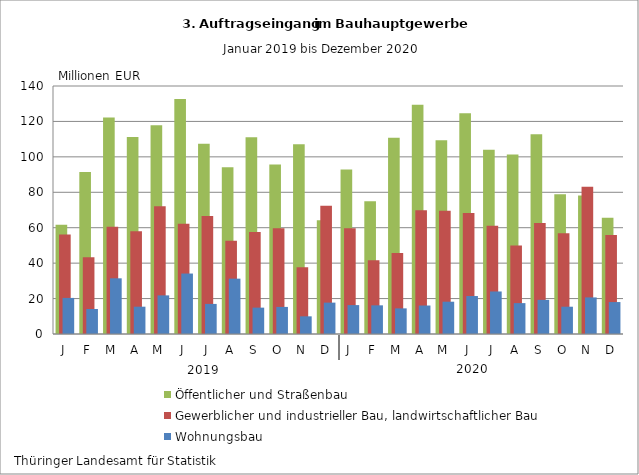
| Category | Öffentlicher und Straßenbau | Gewerblicher und industrieller Bau, landwirtschaftlicher Bau | Wohnungsbau |
|---|---|---|---|
| J | 61.69 | 56.233 | 20.365 |
| F | 91.411 | 43.325 | 14.108 |
| M | 122.252 | 60.475 | 31.437 |
| A | 111.149 | 58.038 | 15.419 |
| M | 117.863 | 72.11 | 21.8 |
| J | 132.621 | 62.253 | 34.13 |
| J | 107.368 | 66.65 | 16.981 |
| A | 94.135 | 52.591 | 31.245 |
| S | 111.01 | 57.583 | 14.884 |
| O | 95.748 | 59.67 | 15.291 |
| N | 107.073 | 37.655 | 9.972 |
| D | 64.218 | 72.395 | 17.714 |
| J | 92.884 | 59.676 | 16.317 |
| F | 74.93 | 41.589 | 16.181 |
| M | 110.829 | 45.773 | 14.469 |
| A | 129.402 | 69.805 | 16.076 |
| M | 109.423 | 69.565 | 18.232 |
| J | 124.616 | 68.306 | 21.434 |
| J | 104.001 | 61.055 | 24.007 |
| A | 101.27 | 50.014 | 17.435 |
| S | 112.783 | 62.704 | 19.28 |
| O | 78.824 | 56.908 | 15.402 |
| N | 78.251 | 83.144 | 20.651 |
| D | 65.683 | 55.86 | 18.035 |